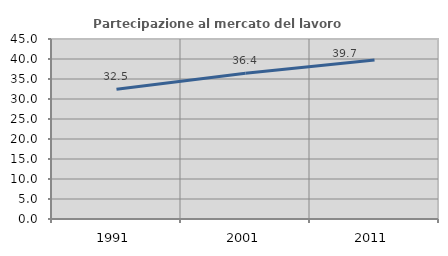
| Category | Partecipazione al mercato del lavoro  femminile |
|---|---|
| 1991.0 | 32.463 |
| 2001.0 | 36.45 |
| 2011.0 | 39.727 |